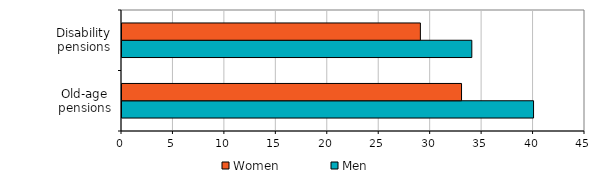
| Category | Men | Women |
|---|---|---|
| Old-age
pensions | 40 | 33 |
| Disability pensions | 34 | 29 |